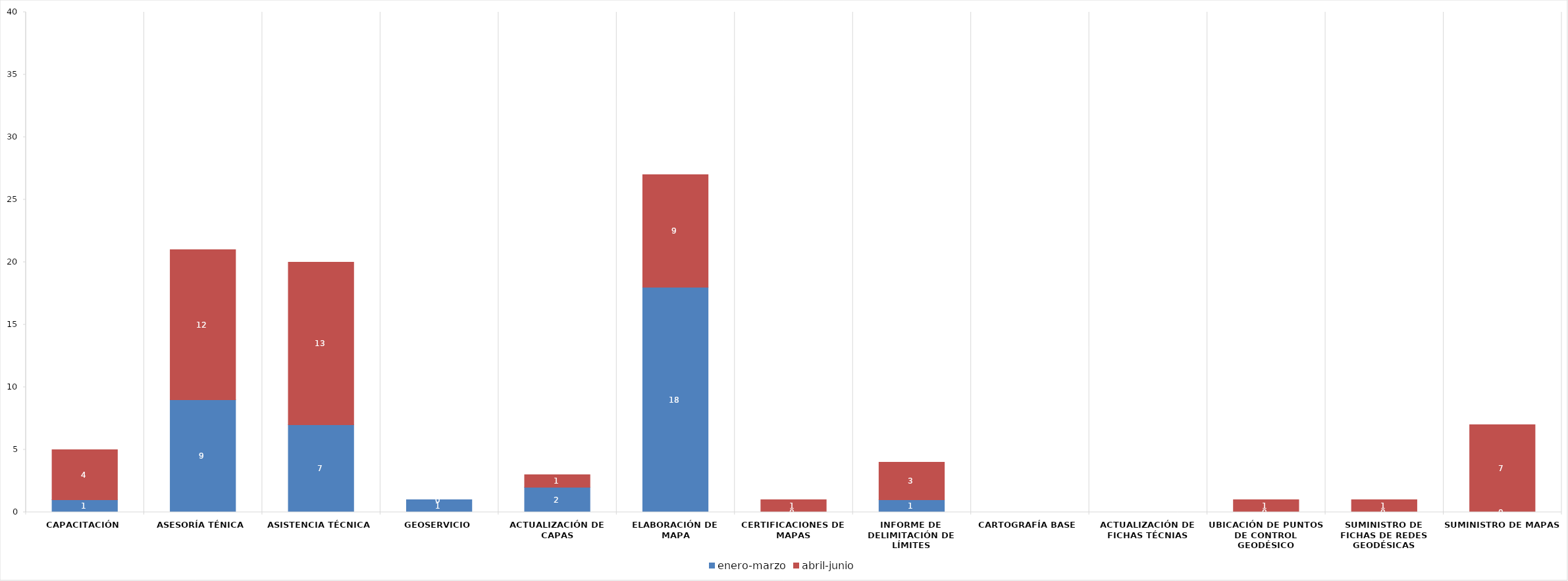
| Category | enero-marzo | abril-junio |
|---|---|---|
| Capacitación | 1 | 4 |
| Asesoría ténica | 9 | 12 |
| Asistencia técnica | 7 | 13 |
| Geoservicio | 1 | 0 |
| Actualización de capas | 2 | 1 |
| Elaboración de mapa | 18 | 9 |
| Certificaciones de mapas | 0 | 1 |
| Informe de delimitación de límites | 1 | 3 |
| Cartografía base | 0 | 0 |
| Actualización de fichas técnias | 0 | 0 |
| Ubicación de puntos de control geodésico | 0 | 1 |
| Suministro de fichas de redes geodésicas | 0 | 1 |
| Suministro de mapas | 0 | 7 |